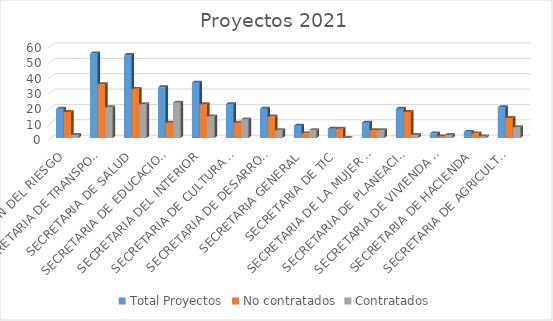
| Category | Total Proyectos | No contratados | Contratados |
|---|---|---|---|
| GESTIÓN DEL RIESGO | 19 | 17 | 2 |
| SECRETARIA DE TRANSPORTE E INFRAESTRUCTURA | 55 | 35 | 20 |
| SECRETARIA DE SALUD | 54 | 32 | 22 |
| SECRETARIA DE EDUCACION | 33 | 10 | 23 |
| SECRETARIA DEL INTERIOR | 36 | 22 | 14 |
| SECRETARIA DE CULTURA Y TURISMO | 22 | 10 | 12 |
| SECRETARIA DE DESARROLLO SOCIAL | 19 | 14 | 5 |
| SECRETARIA GENERAL | 8 | 3 | 5 |
| SECRETARIA DE TIC | 6 | 6 | 0 |
| SECRETARIA DE LA MUJER Y EQUIDAD DE GENERO | 10 | 5 | 5 |
| SECRETARIA DE PLANEACION | 19 | 17 | 2 |
| SECRETARIA DE VIVIENDA Y HABITAT SUSTENTABLE | 3 | 1 | 2 |
| SECRETARIA DE HACIENDA | 4 | 3 | 1 |
| SECRETARIA DE AGRICULTURA | 20 | 13 | 7 |